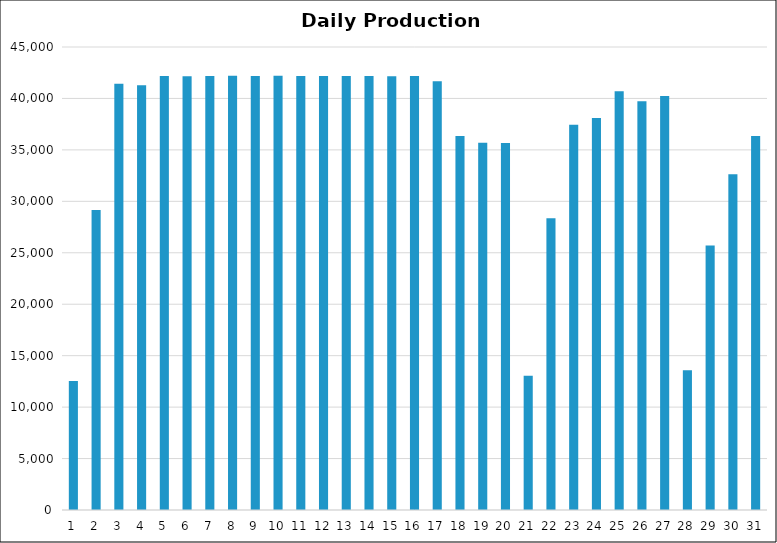
| Category | Series 0 |
|---|---|
| 0 | 12543 |
| 1 | 29149.5 |
| 2 | 41430.25 |
| 3 | 41283 |
| 4 | 42179.5 |
| 5 | 42151.5 |
| 6 | 42190 |
| 7 | 42207 |
| 8 | 42176 |
| 9 | 42197.75 |
| 10 | 42172.25 |
| 11 | 42174 |
| 12 | 42171.5 |
| 13 | 42173.75 |
| 14 | 42160.25 |
| 15 | 42174.5 |
| 16 | 41682.5 |
| 17 | 36339 |
| 18 | 35699.75 |
| 19 | 35661.75 |
| 20 | 13044.25 |
| 21 | 28351 |
| 22 | 37445.25 |
| 23 | 38092.5 |
| 24 | 40695.75 |
| 25 | 39734.25 |
| 26 | 40237.5 |
| 27 | 13583 |
| 28 | 25707.5 |
| 29 | 32633.5 |
| 30 | 36360 |